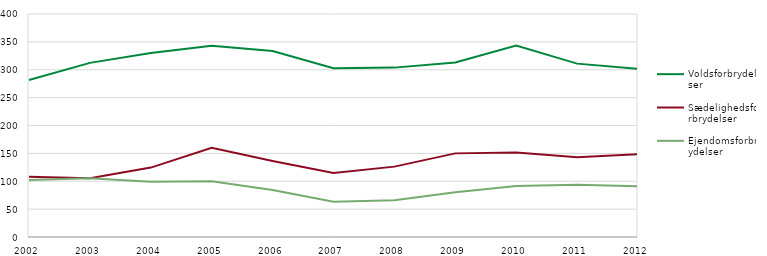
| Category | Voldsforbrydelser | Sædelighedsforbrydelser | Ejendomsforbrydelser |
|---|---|---|---|
| 2002.0 | 281.485 | 108.042 | 102.395 |
| 2003.0 | 312.36 | 105.245 | 105.522 |
| 2004.0 | 330.01 | 124.476 | 99.257 |
| 2005.0 | 342.93 | 160.14 | 99.889 |
| 2006.0 | 333.774 | 136.364 | 84.287 |
| 2007.0 | 302.798 | 114.685 | 63.34 |
| 2008.0 | 303.815 | 126.224 | 65.913 |
| 2009.0 | 313.123 | 150 | 80.195 |
| 2010.0 | 343.337 | 151.399 | 91.661 |
| 2011.0 | 310.987 | 143.007 | 93.746 |
| 2012.0 | 301.526 | 148.601 | 91.073 |